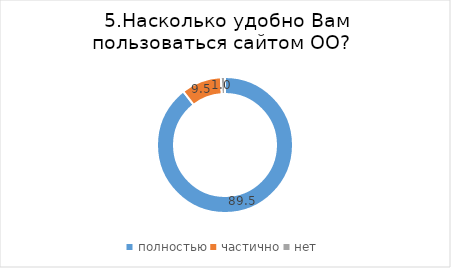
| Category | Series 0 |
|---|---|
| полностью | 89.474 |
| частично | 9.539 |
| нет | 0.987 |